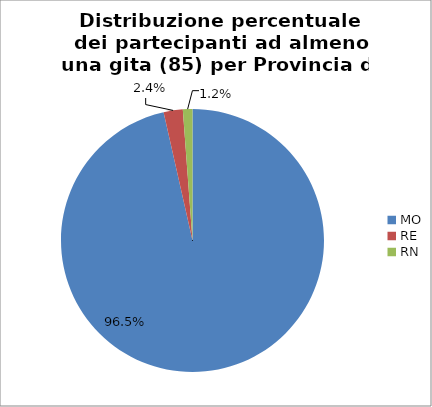
| Category | Nr. Tesserati |
|---|---|
| MO | 82 |
| RE | 2 |
| RN | 1 |